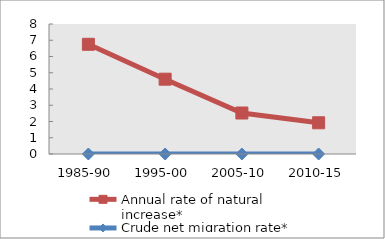
| Category | Annual rate of natural increase* | Crude net migration rate* |
|---|---|---|
| 1985-90 | 6.751 | 0 |
| 1995-00 | 4.604 | 0 |
| 2005-10 | 2.523 | 0 |
| 2010-15 | 1.922 | 0 |